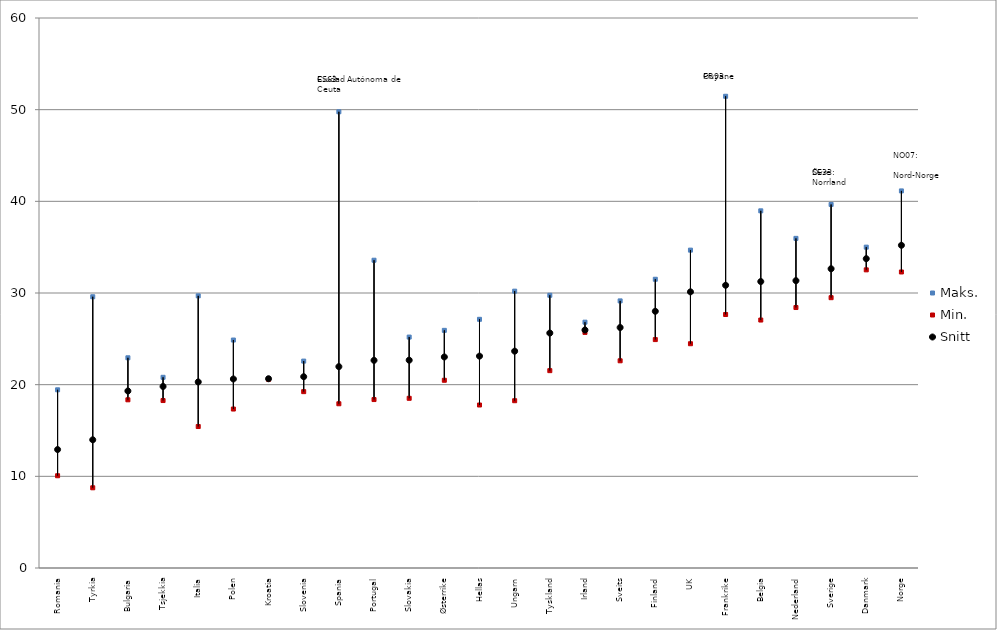
| Category | Maks. | Min. | Snitt |
|---|---|---|---|
| Romania | 19.439 | 10.065 | 12.922 |
| Tyrkia | 29.59 | 8.75 | 13.986 |
| Bulgaria | 22.932 | 18.349 | 19.312 |
| Tsjekkia | 20.804 | 18.269 | 19.804 |
| Italia | 29.689 | 15.434 | 20.296 |
| Polen | 24.868 | 17.342 | 20.62 |
| Kroatia | 20.678 | 20.586 | 20.648 |
| Slovenia | 22.571 | 19.238 | 20.868 |
| Spania | 49.77 | 17.917 | 21.968 |
| Portugal | 33.576 | 18.375 | 22.652 |
| Slovakia | 25.19 | 18.513 | 22.672 |
| Østerrike | 25.926 | 20.48 | 23.022 |
| Hellas | 27.129 | 17.78 | 23.115 |
| Ungarn | 30.201 | 18.249 | 23.654 |
| Tyskland | 29.752 | 21.529 | 25.629 |
| Irland | 26.817 | 25.702 | 25.963 |
| Sveits | 29.138 | 22.605 | 26.235 |
| Finland | 31.5 | 24.918 | 28.004 |
| UK | 34.676 | 24.466 | 30.127 |
| Frankrike | 51.461 | 27.654 | 30.843 |
| Belgia | 38.964 | 27.05 | 31.25 |
| Nederland | 35.961 | 28.415 | 31.347 |
| Sverige | 39.659 | 29.49 | 32.645 |
| Danmark | 35.002 | 32.525 | 33.743 |
| Norge | 41.136 | 32.294 | 35.204 |